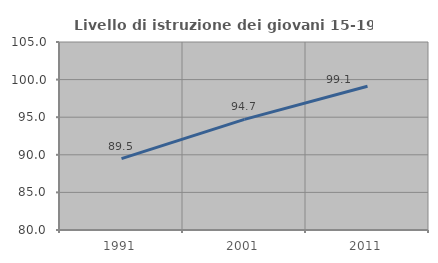
| Category | Livello di istruzione dei giovani 15-19 anni |
|---|---|
| 1991.0 | 89.494 |
| 2001.0 | 94.715 |
| 2011.0 | 99.114 |